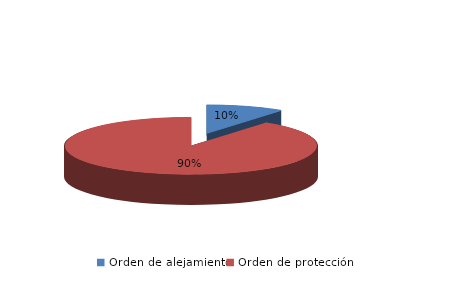
| Category | Series 0 |
|---|---|
| Orden de alejamiento | 35 |
| Orden de protección | 316 |